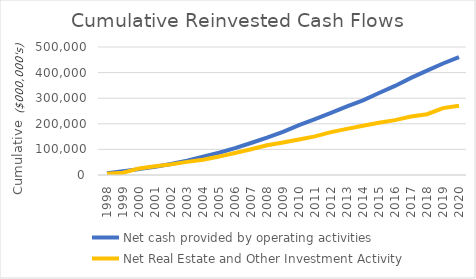
| Category | Net cash provided by operating activities | Net Real Estate and Other Investment Activity |
|---|---|---|
| 1998.0 | 7123 | 4421 |
| 1999.0 | 14703 | 8839 |
| 2000.0 | 22897 | 25685 |
| 2001.0 | 32501 | 34399 |
| 2002.0 | 43020 | 41533 |
| 2003.0 | 56025 | 51289 |
| 2004.0 | 72021 | 59576 |
| 2005.0 | 87065 | 71927 |
| 2006.0 | 104698 | 86110 |
| 2007.0 | 124933 | 100617 |
| 2008.0 | 145575 | 116287 |
| 2009.0 | 168722 | 127029 |
| 2010.0 | 194971 | 138649 |
| 2011.0 | 218614 | 150842 |
| 2012.0 | 242869 | 167451 |
| 2013.0 | 268460 | 180088 |
| 2014.0 | 291717 | 192614 |
| 2015.0 | 320281 | 203739 |
| 2016.0 | 347833 | 214414 |
| 2017.0 | 379506 | 228310 |
| 2018.0 | 407843 | 237389 |
| 2019.0 | 435596 | 261425 |
| 2020.0 | 460851 | 270553 |